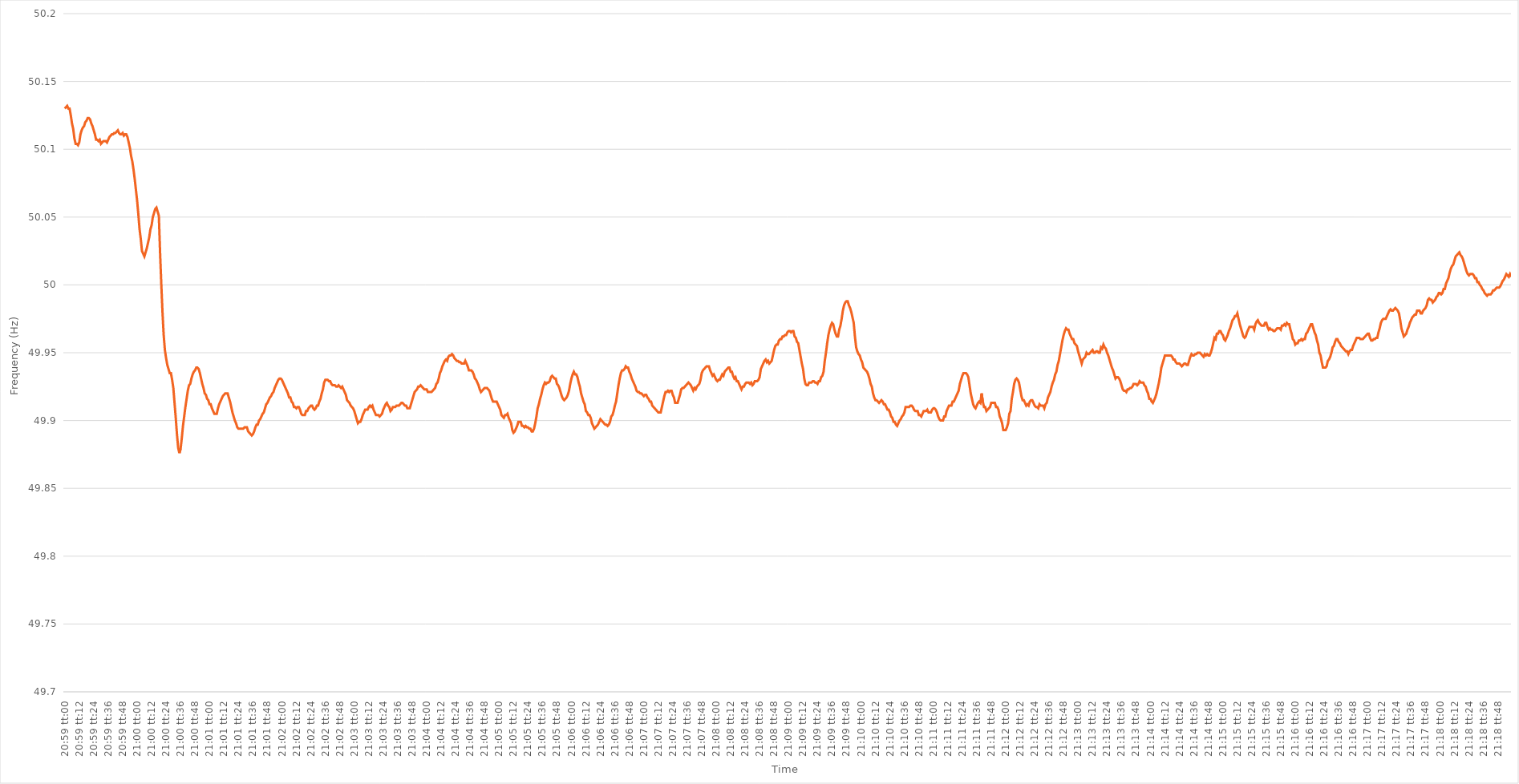
| Category | Series 0 |
|---|---|
| 0.8743055555555556 | 50.13 |
| 0.8743171296296296 | 50.131 |
| 0.8743287037037036 | 50.132 |
| 0.8743402777777778 | 50.13 |
| 0.8743518518518519 | 50.13 |
| 0.8743634259259259 | 50.125 |
| 0.874375 | 50.119 |
| 0.874386574074074 | 50.115 |
| 0.8743981481481482 | 50.108 |
| 0.8744097222222221 | 50.104 |
| 0.8744212962962963 | 50.104 |
| 0.8744328703703704 | 50.103 |
| 0.8744444444444445 | 50.105 |
| 0.8744560185185185 | 50.111 |
| 0.8744675925925925 | 50.114 |
| 0.8744791666666667 | 50.116 |
| 0.8744907407407408 | 50.117 |
| 0.8745023148148148 | 50.12 |
| 0.8745138888888889 | 50.121 |
| 0.874525462962963 | 50.123 |
| 0.874537037037037 | 50.123 |
| 0.874548611111111 | 50.122 |
| 0.8745601851851852 | 50.119 |
| 0.8745717592592593 | 50.117 |
| 0.8745833333333333 | 50.114 |
| 0.8745949074074074 | 50.111 |
| 0.8746064814814815 | 50.107 |
| 0.8746180555555556 | 50.107 |
| 0.8746296296296295 | 50.106 |
| 0.8746412037037037 | 50.107 |
| 0.8746527777777778 | 50.104 |
| 0.8746643518518519 | 50.105 |
| 0.8746759259259259 | 50.106 |
| 0.8746875 | 50.106 |
| 0.8746990740740741 | 50.106 |
| 0.8747106481481483 | 50.105 |
| 0.8747222222222222 | 50.107 |
| 0.8747337962962963 | 50.109 |
| 0.8747453703703704 | 50.11 |
| 0.8747569444444444 | 50.111 |
| 0.8747685185185184 | 50.111 |
| 0.8747800925925926 | 50.112 |
| 0.8747916666666667 | 50.112 |
| 0.8748032407407407 | 50.113 |
| 0.8748148148148148 | 50.114 |
| 0.8748263888888889 | 50.112 |
| 0.874837962962963 | 50.111 |
| 0.8748495370370369 | 50.111 |
| 0.8748611111111111 | 50.112 |
| 0.8748726851851852 | 50.11 |
| 0.8748842592592593 | 50.111 |
| 0.8748958333333333 | 50.111 |
| 0.8749074074074074 | 50.109 |
| 0.8749189814814815 | 50.105 |
| 0.8749305555555557 | 50.101 |
| 0.8749421296296296 | 50.095 |
| 0.8749537037037037 | 50.091 |
| 0.8749652777777778 | 50.085 |
| 0.8749768518518519 | 50.078 |
| 0.8749884259259259 | 50.07 |
| 0.875 | 50.062 |
| 0.8750115740740741 | 50.052 |
| 0.8750231481481481 | 50.041 |
| 0.8750347222222222 | 50.034 |
| 0.8750462962962963 | 50.025 |
| 0.8750578703703704 | 50.023 |
| 0.8750694444444443 | 50.021 |
| 0.8750810185185185 | 50.024 |
| 0.8750925925925926 | 50.027 |
| 0.8751041666666667 | 50.031 |
| 0.8751157407407407 | 50.035 |
| 0.8751273148148148 | 50.041 |
| 0.8751388888888889 | 50.044 |
| 0.8751504629629631 | 50.05 |
| 0.875162037037037 | 50.053 |
| 0.8751736111111111 | 50.056 |
| 0.8751851851851852 | 50.057 |
| 0.8751967592592593 | 50.054 |
| 0.8752083333333333 | 50.051 |
| 0.8752199074074074 | 50.024 |
| 0.8752314814814816 | 50.001 |
| 0.8752430555555555 | 49.98 |
| 0.8752546296296296 | 49.963 |
| 0.8752662037037037 | 49.952 |
| 0.8752777777777778 | 49.946 |
| 0.8752893518518517 | 49.941 |
| 0.8753009259259259 | 49.938 |
| 0.8753125 | 49.935 |
| 0.8753240740740741 | 49.935 |
| 0.8753356481481481 | 49.93 |
| 0.8753472222222222 | 49.924 |
| 0.8753587962962963 | 49.913 |
| 0.8753703703703705 | 49.902 |
| 0.8753819444444444 | 49.89 |
| 0.8753935185185185 | 49.88 |
| 0.8754050925925926 | 49.876 |
| 0.8754166666666667 | 49.879 |
| 0.8754282407407407 | 49.887 |
| 0.8754398148148148 | 49.896 |
| 0.875451388888889 | 49.903 |
| 0.875462962962963 | 49.91 |
| 0.875474537037037 | 49.916 |
| 0.8754861111111111 | 49.922 |
| 0.8754976851851852 | 49.926 |
| 0.8755092592592592 | 49.927 |
| 0.8755208333333333 | 49.931 |
| 0.8755324074074075 | 49.934 |
| 0.8755439814814815 | 49.936 |
| 0.8755555555555555 | 49.937 |
| 0.8755671296296296 | 49.939 |
| 0.8755787037037037 | 49.939 |
| 0.8755902777777779 | 49.938 |
| 0.8756018518518518 | 49.935 |
| 0.875613425925926 | 49.931 |
| 0.875625 | 49.927 |
| 0.8756365740740741 | 49.924 |
| 0.8756481481481481 | 49.92 |
| 0.8756597222222222 | 49.919 |
| 0.8756712962962964 | 49.916 |
| 0.8756828703703704 | 49.915 |
| 0.8756944444444444 | 49.912 |
| 0.8757060185185185 | 49.912 |
| 0.8757175925925926 | 49.909 |
| 0.8757291666666666 | 49.907 |
| 0.8757407407407407 | 49.905 |
| 0.8757523148148149 | 49.905 |
| 0.8757638888888889 | 49.905 |
| 0.8757754629629629 | 49.909 |
| 0.875787037037037 | 49.912 |
| 0.8757986111111111 | 49.914 |
| 0.8758101851851853 | 49.916 |
| 0.8758217592592592 | 49.918 |
| 0.8758333333333334 | 49.919 |
| 0.8758449074074074 | 49.92 |
| 0.8758564814814815 | 49.92 |
| 0.8758680555555555 | 49.92 |
| 0.8758796296296296 | 49.917 |
| 0.8758912037037038 | 49.914 |
| 0.8759027777777778 | 49.91 |
| 0.8759143518518518 | 49.906 |
| 0.8759259259259259 | 49.903 |
| 0.8759375 | 49.9 |
| 0.875949074074074 | 49.898 |
| 0.8759606481481481 | 49.895 |
| 0.8759722222222223 | 49.894 |
| 0.8759837962962963 | 49.894 |
| 0.8759953703703703 | 49.894 |
| 0.8760069444444444 | 49.894 |
| 0.8760185185185185 | 49.894 |
| 0.8760300925925927 | 49.895 |
| 0.8760416666666666 | 49.895 |
| 0.8760532407407408 | 49.895 |
| 0.8760648148148148 | 49.892 |
| 0.876076388888889 | 49.891 |
| 0.8760879629629629 | 49.89 |
| 0.876099537037037 | 49.889 |
| 0.8761111111111112 | 49.89 |
| 0.8761226851851852 | 49.892 |
| 0.8761342592592593 | 49.895 |
| 0.8761458333333333 | 49.897 |
| 0.8761574074074074 | 49.897 |
| 0.8761689814814816 | 49.9 |
| 0.8761805555555555 | 49.901 |
| 0.8761921296296297 | 49.903 |
| 0.8762037037037037 | 49.905 |
| 0.8762152777777777 | 49.906 |
| 0.8762268518518518 | 49.909 |
| 0.8762384259259259 | 49.912 |
| 0.8762500000000001 | 49.913 |
| 0.876261574074074 | 49.915 |
| 0.8762731481481482 | 49.917 |
| 0.8762847222222222 | 49.918 |
| 0.8762962962962964 | 49.92 |
| 0.8763078703703703 | 49.921 |
| 0.8763194444444444 | 49.924 |
| 0.8763310185185186 | 49.926 |
| 0.8763425925925926 | 49.928 |
| 0.8763541666666667 | 49.93 |
| 0.8763657407407407 | 49.931 |
| 0.8763773148148148 | 49.931 |
| 0.876388888888889 | 49.93 |
| 0.8764004629629629 | 49.928 |
| 0.8764120370370371 | 49.926 |
| 0.8764236111111111 | 49.924 |
| 0.8764351851851852 | 49.922 |
| 0.8764467592592592 | 49.92 |
| 0.8764583333333333 | 49.917 |
| 0.8764699074074075 | 49.917 |
| 0.8764814814814814 | 49.914 |
| 0.8764930555555556 | 49.913 |
| 0.8765046296296296 | 49.91 |
| 0.8765162037037038 | 49.91 |
| 0.8765277777777777 | 49.909 |
| 0.8765393518518518 | 49.91 |
| 0.876550925925926 | 49.91 |
| 0.8765625 | 49.908 |
| 0.8765740740740741 | 49.905 |
| 0.8765856481481481 | 49.904 |
| 0.8765972222222222 | 49.904 |
| 0.8766087962962964 | 49.904 |
| 0.8766203703703703 | 49.907 |
| 0.8766319444444445 | 49.907 |
| 0.8766435185185185 | 49.909 |
| 0.8766550925925927 | 49.91 |
| 0.8766666666666666 | 49.911 |
| 0.8766782407407407 | 49.911 |
| 0.8766898148148149 | 49.909 |
| 0.8767013888888888 | 49.908 |
| 0.876712962962963 | 49.909 |
| 0.876724537037037 | 49.911 |
| 0.8767361111111112 | 49.911 |
| 0.8767476851851851 | 49.914 |
| 0.8767592592592592 | 49.916 |
| 0.8767708333333334 | 49.92 |
| 0.8767824074074074 | 49.923 |
| 0.8767939814814815 | 49.928 |
| 0.8768055555555555 | 49.93 |
| 0.8768171296296297 | 49.93 |
| 0.8768287037037038 | 49.93 |
| 0.8768402777777777 | 49.929 |
| 0.8768518518518519 | 49.929 |
| 0.8768634259259259 | 49.927 |
| 0.8768750000000001 | 49.926 |
| 0.876886574074074 | 49.926 |
| 0.8768981481481481 | 49.926 |
| 0.8769097222222223 | 49.925 |
| 0.8769212962962962 | 49.925 |
| 0.8769328703703704 | 49.926 |
| 0.8769444444444444 | 49.925 |
| 0.8769560185185186 | 49.924 |
| 0.8769675925925925 | 49.925 |
| 0.8769791666666666 | 49.923 |
| 0.8769907407407408 | 49.921 |
| 0.8770023148148148 | 49.919 |
| 0.8770138888888889 | 49.915 |
| 0.8770254629629629 | 49.914 |
| 0.8770370370370371 | 49.913 |
| 0.8770486111111112 | 49.911 |
| 0.8770601851851851 | 49.91 |
| 0.8770717592592593 | 49.909 |
| 0.8770833333333333 | 49.907 |
| 0.8770949074074075 | 49.904 |
| 0.8771064814814814 | 49.901 |
| 0.8771180555555556 | 49.898 |
| 0.8771296296296297 | 49.899 |
| 0.8771412037037036 | 49.899 |
| 0.8771527777777778 | 49.901 |
| 0.8771643518518518 | 49.904 |
| 0.877175925925926 | 49.906 |
| 0.8771874999999999 | 49.908 |
| 0.877199074074074 | 49.908 |
| 0.8772106481481482 | 49.908 |
| 0.8772222222222222 | 49.91 |
| 0.8772337962962963 | 49.911 |
| 0.8772453703703703 | 49.91 |
| 0.8772569444444445 | 49.911 |
| 0.8772685185185186 | 49.908 |
| 0.8772800925925925 | 49.906 |
| 0.8772916666666667 | 49.904 |
| 0.8773032407407407 | 49.904 |
| 0.8773148148148149 | 49.904 |
| 0.8773263888888888 | 49.903 |
| 0.877337962962963 | 49.904 |
| 0.8773495370370371 | 49.905 |
| 0.8773611111111111 | 49.908 |
| 0.8773726851851852 | 49.91 |
| 0.8773842592592592 | 49.912 |
| 0.8773958333333334 | 49.913 |
| 0.8774074074074073 | 49.911 |
| 0.8774189814814815 | 49.91 |
| 0.8774305555555556 | 49.907 |
| 0.8774421296296296 | 49.908 |
| 0.8774537037037037 | 49.91 |
| 0.8774652777777777 | 49.91 |
| 0.8774768518518519 | 49.91 |
| 0.877488425925926 | 49.911 |
| 0.8775 | 49.911 |
| 0.8775115740740741 | 49.911 |
| 0.8775231481481481 | 49.912 |
| 0.8775347222222223 | 49.913 |
| 0.8775462962962962 | 49.913 |
| 0.8775578703703704 | 49.912 |
| 0.8775694444444445 | 49.911 |
| 0.8775810185185186 | 49.911 |
| 0.8775925925925926 | 49.909 |
| 0.8776041666666666 | 49.909 |
| 0.8776157407407408 | 49.909 |
| 0.8776273148148147 | 49.912 |
| 0.8776388888888889 | 49.915 |
| 0.877650462962963 | 49.918 |
| 0.877662037037037 | 49.921 |
| 0.8776736111111111 | 49.922 |
| 0.8776851851851851 | 49.923 |
| 0.8776967592592593 | 49.925 |
| 0.8777083333333334 | 49.925 |
| 0.8777199074074074 | 49.926 |
| 0.8777314814814815 | 49.925 |
| 0.8777430555555555 | 49.924 |
| 0.8777546296296297 | 49.923 |
| 0.8777662037037036 | 49.923 |
| 0.8777777777777778 | 49.923 |
| 0.8777893518518519 | 49.921 |
| 0.877800925925926 | 49.921 |
| 0.8778125 | 49.921 |
| 0.877824074074074 | 49.921 |
| 0.8778356481481482 | 49.922 |
| 0.8778472222222221 | 49.923 |
| 0.8778587962962963 | 49.924 |
| 0.8778703703703704 | 49.927 |
| 0.8778819444444445 | 49.928 |
| 0.8778935185185185 | 49.931 |
| 0.8779050925925925 | 49.935 |
| 0.8779166666666667 | 49.937 |
| 0.8779282407407408 | 49.94 |
| 0.8779398148148148 | 49.942 |
| 0.8779513888888889 | 49.944 |
| 0.877962962962963 | 49.945 |
| 0.8779745370370371 | 49.944 |
| 0.877986111111111 | 49.947 |
| 0.8779976851851852 | 49.948 |
| 0.8780092592592593 | 49.948 |
| 0.8780208333333334 | 49.949 |
| 0.8780324074074074 | 49.948 |
| 0.8780439814814814 | 49.946 |
| 0.8780555555555556 | 49.945 |
| 0.8780671296296297 | 49.944 |
| 0.8780787037037037 | 49.944 |
| 0.8780902777777778 | 49.943 |
| 0.8781018518518519 | 49.943 |
| 0.8781134259259259 | 49.942 |
| 0.8781249999999999 | 49.942 |
| 0.8781365740740741 | 49.942 |
| 0.8781481481481482 | 49.944 |
| 0.8781597222222222 | 49.942 |
| 0.8781712962962963 | 49.94 |
| 0.8781828703703703 | 49.937 |
| 0.8781944444444445 | 49.937 |
| 0.8782060185185184 | 49.937 |
| 0.8782175925925926 | 49.936 |
| 0.8782291666666667 | 49.934 |
| 0.8782407407407408 | 49.931 |
| 0.8782523148148148 | 49.93 |
| 0.8782638888888888 | 49.928 |
| 0.878275462962963 | 49.926 |
| 0.8782870370370371 | 49.923 |
| 0.8782986111111111 | 49.921 |
| 0.8783101851851852 | 49.922 |
| 0.8783217592592593 | 49.923 |
| 0.8783333333333333 | 49.924 |
| 0.8783449074074073 | 49.924 |
| 0.8783564814814815 | 49.924 |
| 0.8783680555555556 | 49.923 |
| 0.8783796296296296 | 49.922 |
| 0.8783912037037037 | 49.919 |
| 0.8784027777777778 | 49.916 |
| 0.8784143518518519 | 49.914 |
| 0.8784259259259258 | 49.914 |
| 0.8784375 | 49.914 |
| 0.8784490740740741 | 49.914 |
| 0.8784606481481482 | 49.912 |
| 0.8784722222222222 | 49.91 |
| 0.8784837962962962 | 49.908 |
| 0.8784953703703704 | 49.904 |
| 0.8785069444444445 | 49.903 |
| 0.8785185185185185 | 49.902 |
| 0.8785300925925926 | 49.904 |
| 0.8785416666666667 | 49.904 |
| 0.8785532407407407 | 49.905 |
| 0.8785648148148147 | 49.902 |
| 0.8785763888888889 | 49.9 |
| 0.878587962962963 | 49.898 |
| 0.878599537037037 | 49.893 |
| 0.8786111111111111 | 49.891 |
| 0.8786226851851852 | 49.892 |
| 0.8786342592592593 | 49.894 |
| 0.8786458333333332 | 49.896 |
| 0.8786574074074074 | 49.899 |
| 0.8786689814814815 | 49.899 |
| 0.8786805555555556 | 49.899 |
| 0.8786921296296296 | 49.896 |
| 0.8787037037037037 | 49.896 |
| 0.8787152777777778 | 49.895 |
| 0.878726851851852 | 49.896 |
| 0.8787384259259259 | 49.895 |
| 0.87875 | 49.895 |
| 0.8787615740740741 | 49.894 |
| 0.8787731481481482 | 49.894 |
| 0.8787847222222221 | 49.892 |
| 0.8787962962962963 | 49.892 |
| 0.8788078703703704 | 49.894 |
| 0.8788194444444444 | 49.898 |
| 0.8788310185185185 | 49.903 |
| 0.8788425925925926 | 49.909 |
| 0.8788541666666667 | 49.912 |
| 0.8788657407407406 | 49.916 |
| 0.8788773148148148 | 49.919 |
| 0.8788888888888889 | 49.923 |
| 0.878900462962963 | 49.926 |
| 0.878912037037037 | 49.928 |
| 0.8789236111111111 | 49.927 |
| 0.8789351851851852 | 49.928 |
| 0.8789467592592594 | 49.928 |
| 0.8789583333333333 | 49.929 |
| 0.8789699074074074 | 49.932 |
| 0.8789814814814815 | 49.933 |
| 0.8789930555555556 | 49.932 |
| 0.8790046296296296 | 49.931 |
| 0.8790162037037037 | 49.931 |
| 0.8790277777777779 | 49.927 |
| 0.8790393518518518 | 49.926 |
| 0.8790509259259259 | 49.924 |
| 0.8790625 | 49.921 |
| 0.8790740740740741 | 49.918 |
| 0.879085648148148 | 49.916 |
| 0.8790972222222222 | 49.915 |
| 0.8791087962962963 | 49.916 |
| 0.8791203703703704 | 49.917 |
| 0.8791319444444444 | 49.919 |
| 0.8791435185185185 | 49.922 |
| 0.8791550925925926 | 49.927 |
| 0.8791666666666668 | 49.931 |
| 0.8791782407407407 | 49.934 |
| 0.8791898148148148 | 49.936 |
| 0.8792013888888889 | 49.934 |
| 0.879212962962963 | 49.934 |
| 0.879224537037037 | 49.932 |
| 0.8792361111111111 | 49.928 |
| 0.8792476851851853 | 49.925 |
| 0.8792592592592593 | 49.92 |
| 0.8792708333333333 | 49.917 |
| 0.8792824074074074 | 49.914 |
| 0.8792939814814815 | 49.912 |
| 0.8793055555555555 | 49.907 |
| 0.8793171296296296 | 49.906 |
| 0.8793287037037038 | 49.904 |
| 0.8793402777777778 | 49.904 |
| 0.8793518518518518 | 49.902 |
| 0.8793634259259259 | 49.898 |
| 0.879375 | 49.896 |
| 0.8793865740740742 | 49.894 |
| 0.8793981481481481 | 49.895 |
| 0.8794097222222222 | 49.896 |
| 0.8794212962962963 | 49.897 |
| 0.8794328703703704 | 49.899 |
| 0.8794444444444444 | 49.901 |
| 0.8794560185185185 | 49.9 |
| 0.8794675925925927 | 49.899 |
| 0.8794791666666667 | 49.898 |
| 0.8794907407407407 | 49.897 |
| 0.8795023148148148 | 49.897 |
| 0.8795138888888889 | 49.896 |
| 0.8795254629629629 | 49.897 |
| 0.879537037037037 | 49.899 |
| 0.8795486111111112 | 49.903 |
| 0.8795601851851852 | 49.904 |
| 0.8795717592592592 | 49.907 |
| 0.8795833333333333 | 49.911 |
| 0.8795949074074074 | 49.914 |
| 0.8796064814814816 | 49.92 |
| 0.8796180555555555 | 49.926 |
| 0.8796296296296297 | 49.931 |
| 0.8796412037037037 | 49.935 |
| 0.8796527777777778 | 49.937 |
| 0.8796643518518518 | 49.937 |
| 0.8796759259259259 | 49.938 |
| 0.8796875000000001 | 49.94 |
| 0.8796990740740741 | 49.939 |
| 0.8797106481481481 | 49.939 |
| 0.8797222222222222 | 49.936 |
| 0.8797337962962963 | 49.934 |
| 0.8797453703703703 | 49.931 |
| 0.8797569444444444 | 49.929 |
| 0.8797685185185186 | 49.927 |
| 0.8797800925925926 | 49.925 |
| 0.8797916666666666 | 49.922 |
| 0.8798032407407407 | 49.921 |
| 0.8798148148148148 | 49.921 |
| 0.879826388888889 | 49.92 |
| 0.8798379629629629 | 49.92 |
| 0.879849537037037 | 49.919 |
| 0.8798611111111111 | 49.918 |
| 0.8798726851851852 | 49.919 |
| 0.8798842592592592 | 49.919 |
| 0.8798958333333333 | 49.917 |
| 0.8799074074074075 | 49.916 |
| 0.8799189814814815 | 49.914 |
| 0.8799305555555555 | 49.914 |
| 0.8799421296296296 | 49.911 |
| 0.8799537037037037 | 49.91 |
| 0.8799652777777779 | 49.909 |
| 0.8799768518518518 | 49.908 |
| 0.879988425925926 | 49.907 |
| 0.88 | 49.906 |
| 0.880011574074074 | 49.906 |
| 0.8800231481481481 | 49.906 |
| 0.8800347222222222 | 49.91 |
| 0.8800462962962964 | 49.914 |
| 0.8800578703703703 | 49.918 |
| 0.8800694444444445 | 49.921 |
| 0.8800810185185185 | 49.921 |
| 0.8800925925925926 | 49.922 |
| 0.8801041666666666 | 49.921 |
| 0.8801157407407407 | 49.922 |
| 0.8801273148148149 | 49.922 |
| 0.8801388888888889 | 49.919 |
| 0.880150462962963 | 49.917 |
| 0.880162037037037 | 49.913 |
| 0.8801736111111111 | 49.913 |
| 0.8801851851851853 | 49.913 |
| 0.8801967592592592 | 49.916 |
| 0.8802083333333334 | 49.919 |
| 0.8802199074074074 | 49.923 |
| 0.8802314814814814 | 49.924 |
| 0.8802430555555555 | 49.924 |
| 0.8802546296296296 | 49.925 |
| 0.8802662037037038 | 49.926 |
| 0.8802777777777777 | 49.927 |
| 0.8802893518518519 | 49.928 |
| 0.8803009259259259 | 49.927 |
| 0.8803125 | 49.926 |
| 0.880324074074074 | 49.924 |
| 0.8803356481481481 | 49.922 |
| 0.8803472222222223 | 49.924 |
| 0.8803587962962963 | 49.923 |
| 0.8803703703703704 | 49.925 |
| 0.8803819444444444 | 49.926 |
| 0.8803935185185185 | 49.927 |
| 0.8804050925925927 | 49.93 |
| 0.8804166666666666 | 49.935 |
| 0.8804282407407408 | 49.937 |
| 0.8804398148148148 | 49.938 |
| 0.8804513888888889 | 49.939 |
| 0.8804629629629629 | 49.94 |
| 0.880474537037037 | 49.94 |
| 0.8804861111111112 | 49.94 |
| 0.8804976851851851 | 49.937 |
| 0.8805092592592593 | 49.935 |
| 0.8805208333333333 | 49.933 |
| 0.8805324074074075 | 49.934 |
| 0.8805439814814814 | 49.932 |
| 0.8805555555555555 | 49.93 |
| 0.8805671296296297 | 49.929 |
| 0.8805787037037037 | 49.93 |
| 0.8805902777777778 | 49.93 |
| 0.8806018518518518 | 49.932 |
| 0.880613425925926 | 49.934 |
| 0.8806250000000001 | 49.933 |
| 0.880636574074074 | 49.936 |
| 0.8806481481481482 | 49.937 |
| 0.8806597222222222 | 49.938 |
| 0.8806712962962964 | 49.939 |
| 0.8806828703703703 | 49.939 |
| 0.8806944444444444 | 49.936 |
| 0.8807060185185186 | 49.936 |
| 0.8807175925925925 | 49.933 |
| 0.8807291666666667 | 49.931 |
| 0.8807407407407407 | 49.932 |
| 0.8807523148148149 | 49.929 |
| 0.8807638888888888 | 49.929 |
| 0.8807754629629629 | 49.927 |
| 0.8807870370370371 | 49.925 |
| 0.8807986111111111 | 49.923 |
| 0.8808101851851852 | 49.925 |
| 0.8808217592592592 | 49.925 |
| 0.8808333333333334 | 49.927 |
| 0.8808449074074075 | 49.928 |
| 0.8808564814814814 | 49.928 |
| 0.8808680555555556 | 49.928 |
| 0.8808796296296296 | 49.927 |
| 0.8808912037037038 | 49.928 |
| 0.8809027777777777 | 49.926 |
| 0.8809143518518519 | 49.927 |
| 0.880925925925926 | 49.929 |
| 0.8809374999999999 | 49.929 |
| 0.8809490740740741 | 49.929 |
| 0.8809606481481481 | 49.93 |
| 0.8809722222222223 | 49.932 |
| 0.8809837962962962 | 49.938 |
| 0.8809953703703703 | 49.94 |
| 0.8810069444444445 | 49.942 |
| 0.8810185185185185 | 49.944 |
| 0.8810300925925926 | 49.945 |
| 0.8810416666666666 | 49.943 |
| 0.8810532407407408 | 49.944 |
| 0.8810648148148149 | 49.942 |
| 0.8810763888888888 | 49.943 |
| 0.881087962962963 | 49.944 |
| 0.881099537037037 | 49.948 |
| 0.8811111111111112 | 49.952 |
| 0.8811226851851851 | 49.955 |
| 0.8811342592592593 | 49.956 |
| 0.8811458333333334 | 49.956 |
| 0.8811574074074073 | 49.959 |
| 0.8811689814814815 | 49.96 |
| 0.8811805555555555 | 49.96 |
| 0.8811921296296297 | 49.962 |
| 0.8812037037037036 | 49.962 |
| 0.8812152777777778 | 49.963 |
| 0.8812268518518519 | 49.963 |
| 0.8812384259259259 | 49.965 |
| 0.88125 | 49.966 |
| 0.881261574074074 | 49.966 |
| 0.8812731481481482 | 49.965 |
| 0.8812847222222223 | 49.966 |
| 0.8812962962962962 | 49.966 |
| 0.8813078703703704 | 49.962 |
| 0.8813194444444444 | 49.961 |
| 0.8813310185185186 | 49.958 |
| 0.8813425925925925 | 49.957 |
| 0.8813541666666667 | 49.952 |
| 0.8813657407407408 | 49.947 |
| 0.8813773148148148 | 49.942 |
| 0.8813888888888889 | 49.938 |
| 0.8814004629629629 | 49.931 |
| 0.8814120370370371 | 49.927 |
| 0.881423611111111 | 49.926 |
| 0.8814351851851852 | 49.926 |
| 0.8814467592592593 | 49.928 |
| 0.8814583333333333 | 49.928 |
| 0.8814699074074074 | 49.928 |
| 0.8814814814814814 | 49.929 |
| 0.8814930555555556 | 49.929 |
| 0.8815046296296297 | 49.928 |
| 0.8815162037037036 | 49.928 |
| 0.8815277777777778 | 49.927 |
| 0.8815393518518518 | 49.929 |
| 0.881550925925926 | 49.929 |
| 0.8815624999999999 | 49.932 |
| 0.8815740740740741 | 49.933 |
| 0.8815856481481482 | 49.936 |
| 0.8815972222222223 | 49.944 |
| 0.8816087962962963 | 49.95 |
| 0.8816203703703703 | 49.957 |
| 0.8816319444444445 | 49.963 |
| 0.8816435185185184 | 49.967 |
| 0.8816550925925926 | 49.97 |
| 0.8816666666666667 | 49.972 |
| 0.8816782407407407 | 49.971 |
| 0.8816898148148148 | 49.967 |
| 0.8817013888888888 | 49.964 |
| 0.881712962962963 | 49.962 |
| 0.8817245370370371 | 49.962 |
| 0.881736111111111 | 49.967 |
| 0.8817476851851852 | 49.97 |
| 0.8817592592592592 | 49.975 |
| 0.8817708333333334 | 49.981 |
| 0.8817824074074073 | 49.985 |
| 0.8817939814814815 | 49.987 |
| 0.8818055555555556 | 49.988 |
| 0.8818171296296297 | 49.988 |
| 0.8818287037037037 | 49.985 |
| 0.8818402777777777 | 49.983 |
| 0.8818518518518519 | 49.98 |
| 0.881863425925926 | 49.976 |
| 0.881875 | 49.972 |
| 0.8818865740740741 | 49.962 |
| 0.8818981481481482 | 49.954 |
| 0.8819097222222222 | 49.951 |
| 0.8819212962962962 | 49.949 |
| 0.8819328703703704 | 49.948 |
| 0.8819444444444445 | 49.945 |
| 0.8819560185185185 | 49.943 |
| 0.8819675925925926 | 49.939 |
| 0.8819791666666666 | 49.938 |
| 0.8819907407407408 | 49.937 |
| 0.8820023148148147 | 49.936 |
| 0.8820138888888889 | 49.934 |
| 0.882025462962963 | 49.931 |
| 0.8820370370370371 | 49.927 |
| 0.8820486111111111 | 49.925 |
| 0.8820601851851851 | 49.92 |
| 0.8820717592592593 | 49.917 |
| 0.8820833333333334 | 49.915 |
| 0.8820949074074074 | 49.915 |
| 0.8821064814814815 | 49.914 |
| 0.8821180555555556 | 49.913 |
| 0.8821296296296296 | 49.914 |
| 0.8821412037037036 | 49.915 |
| 0.8821527777777778 | 49.914 |
| 0.8821643518518519 | 49.912 |
| 0.8821759259259259 | 49.912 |
| 0.8821875 | 49.91 |
| 0.882199074074074 | 49.908 |
| 0.8822106481481482 | 49.908 |
| 0.8822222222222221 | 49.906 |
| 0.8822337962962963 | 49.903 |
| 0.8822453703703704 | 49.902 |
| 0.8822569444444445 | 49.899 |
| 0.8822685185185185 | 49.899 |
| 0.8822800925925925 | 49.897 |
| 0.8822916666666667 | 49.896 |
| 0.8823032407407408 | 49.898 |
| 0.8823148148148148 | 49.9 |
| 0.8823263888888889 | 49.901 |
| 0.882337962962963 | 49.903 |
| 0.882349537037037 | 49.904 |
| 0.882361111111111 | 49.906 |
| 0.8823726851851852 | 49.91 |
| 0.8823842592592593 | 49.91 |
| 0.8823958333333333 | 49.91 |
| 0.8824074074074074 | 49.91 |
| 0.8824189814814815 | 49.911 |
| 0.8824305555555556 | 49.911 |
| 0.8824421296296295 | 49.91 |
| 0.8824537037037037 | 49.908 |
| 0.8824652777777778 | 49.907 |
| 0.8824768518518519 | 49.907 |
| 0.8824884259259259 | 49.907 |
| 0.8825 | 49.904 |
| 0.8825115740740741 | 49.904 |
| 0.8825231481481483 | 49.903 |
| 0.8825347222222222 | 49.905 |
| 0.8825462962962963 | 49.907 |
| 0.8825578703703704 | 49.907 |
| 0.8825694444444445 | 49.907 |
| 0.8825810185185184 | 49.908 |
| 0.8825925925925926 | 49.906 |
| 0.8826041666666667 | 49.906 |
| 0.8826157407407407 | 49.906 |
| 0.8826273148148148 | 49.908 |
| 0.8826388888888889 | 49.909 |
| 0.882650462962963 | 49.909 |
| 0.8826620370370369 | 49.908 |
| 0.8826736111111111 | 49.906 |
| 0.8826851851851852 | 49.903 |
| 0.8826967592592593 | 49.901 |
| 0.8827083333333333 | 49.9 |
| 0.8827199074074074 | 49.9 |
| 0.8827314814814815 | 49.9 |
| 0.8827430555555557 | 49.903 |
| 0.8827546296296296 | 49.903 |
| 0.8827662037037037 | 49.907 |
| 0.8827777777777778 | 49.909 |
| 0.8827893518518519 | 49.911 |
| 0.8828009259259259 | 49.911 |
| 0.8828125 | 49.911 |
| 0.8828240740740741 | 49.914 |
| 0.8828356481481481 | 49.914 |
| 0.8828472222222222 | 49.916 |
| 0.8828587962962963 | 49.918 |
| 0.8828703703703704 | 49.92 |
| 0.8828819444444443 | 49.922 |
| 0.8828935185185185 | 49.927 |
| 0.8829050925925926 | 49.93 |
| 0.8829166666666667 | 49.933 |
| 0.8829282407407407 | 49.935 |
| 0.8829398148148148 | 49.935 |
| 0.8829513888888889 | 49.935 |
| 0.8829629629629631 | 49.934 |
| 0.882974537037037 | 49.932 |
| 0.8829861111111111 | 49.926 |
| 0.8829976851851852 | 49.92 |
| 0.8830092592592593 | 49.916 |
| 0.8830208333333333 | 49.912 |
| 0.8830324074074074 | 49.91 |
| 0.8830439814814816 | 49.909 |
| 0.8830555555555555 | 49.911 |
| 0.8830671296296296 | 49.913 |
| 0.8830787037037037 | 49.914 |
| 0.8830902777777778 | 49.913 |
| 0.8831018518518517 | 49.92 |
| 0.8831134259259259 | 49.914 |
| 0.883125 | 49.91 |
| 0.8831365740740741 | 49.91 |
| 0.8831481481481481 | 49.907 |
| 0.8831597222222222 | 49.908 |
| 0.8831712962962963 | 49.909 |
| 0.8831828703703705 | 49.91 |
| 0.8831944444444444 | 49.913 |
| 0.8832060185185185 | 49.913 |
| 0.8832175925925926 | 49.913 |
| 0.8832291666666667 | 49.913 |
| 0.8832407407407407 | 49.91 |
| 0.8832523148148148 | 49.91 |
| 0.883263888888889 | 49.908 |
| 0.883275462962963 | 49.903 |
| 0.883287037037037 | 49.901 |
| 0.8832986111111111 | 49.898 |
| 0.8833101851851852 | 49.893 |
| 0.8833217592592592 | 49.893 |
| 0.8833333333333333 | 49.893 |
| 0.8833449074074075 | 49.895 |
| 0.8833564814814815 | 49.898 |
| 0.8833680555555555 | 49.905 |
| 0.8833796296296296 | 49.907 |
| 0.8833912037037037 | 49.916 |
| 0.8834027777777779 | 49.921 |
| 0.8834143518518518 | 49.927 |
| 0.883425925925926 | 49.93 |
| 0.8834375 | 49.931 |
| 0.8834490740740741 | 49.93 |
| 0.8834606481481481 | 49.928 |
| 0.8834722222222222 | 49.923 |
| 0.8834837962962964 | 49.918 |
| 0.8834953703703704 | 49.915 |
| 0.8835069444444444 | 49.915 |
| 0.8835185185185185 | 49.913 |
| 0.8835300925925926 | 49.911 |
| 0.8835416666666666 | 49.912 |
| 0.8835532407407407 | 49.911 |
| 0.8835648148148149 | 49.914 |
| 0.8835763888888889 | 49.915 |
| 0.8835879629629629 | 49.915 |
| 0.883599537037037 | 49.913 |
| 0.8836111111111111 | 49.911 |
| 0.8836226851851853 | 49.91 |
| 0.8836342592592592 | 49.91 |
| 0.8836458333333334 | 49.909 |
| 0.8836574074074074 | 49.912 |
| 0.8836689814814815 | 49.911 |
| 0.8836805555555555 | 49.911 |
| 0.8836921296296296 | 49.911 |
| 0.8837037037037038 | 49.909 |
| 0.8837152777777778 | 49.912 |
| 0.8837268518518518 | 49.913 |
| 0.8837384259259259 | 49.917 |
| 0.88375 | 49.919 |
| 0.883761574074074 | 49.921 |
| 0.8837731481481481 | 49.925 |
| 0.8837847222222223 | 49.928 |
| 0.8837962962962963 | 49.93 |
| 0.8838078703703703 | 49.934 |
| 0.8838194444444444 | 49.936 |
| 0.8838310185185185 | 49.941 |
| 0.8838425925925927 | 49.944 |
| 0.8838541666666666 | 49.949 |
| 0.8838657407407408 | 49.954 |
| 0.8838773148148148 | 49.959 |
| 0.883888888888889 | 49.963 |
| 0.8839004629629629 | 49.966 |
| 0.883912037037037 | 49.968 |
| 0.8839236111111112 | 49.967 |
| 0.8839351851851852 | 49.967 |
| 0.8839467592592593 | 49.964 |
| 0.8839583333333333 | 49.962 |
| 0.8839699074074074 | 49.96 |
| 0.8839814814814816 | 49.96 |
| 0.8839930555555555 | 49.957 |
| 0.8840046296296297 | 49.956 |
| 0.8840162037037037 | 49.955 |
| 0.8840277777777777 | 49.951 |
| 0.8840393518518518 | 49.948 |
| 0.8840509259259259 | 49.945 |
| 0.8840625000000001 | 49.942 |
| 0.884074074074074 | 49.945 |
| 0.8840856481481482 | 49.946 |
| 0.8840972222222222 | 49.947 |
| 0.8841087962962964 | 49.95 |
| 0.8841203703703703 | 49.949 |
| 0.8841319444444444 | 49.949 |
| 0.8841435185185186 | 49.95 |
| 0.8841550925925926 | 49.951 |
| 0.8841666666666667 | 49.952 |
| 0.8841782407407407 | 49.95 |
| 0.8841898148148148 | 49.95 |
| 0.884201388888889 | 49.951 |
| 0.8842129629629629 | 49.951 |
| 0.8842245370370371 | 49.95 |
| 0.8842361111111111 | 49.95 |
| 0.8842476851851852 | 49.954 |
| 0.8842592592592592 | 49.953 |
| 0.8842708333333333 | 49.956 |
| 0.8842824074074075 | 49.954 |
| 0.8842939814814814 | 49.953 |
| 0.8843055555555556 | 49.95 |
| 0.8843171296296296 | 49.948 |
| 0.8843287037037038 | 49.945 |
| 0.8843402777777777 | 49.942 |
| 0.8843518518518518 | 49.939 |
| 0.884363425925926 | 49.937 |
| 0.884375 | 49.934 |
| 0.8843865740740741 | 49.931 |
| 0.8843981481481481 | 49.932 |
| 0.8844097222222222 | 49.932 |
| 0.8844212962962964 | 49.931 |
| 0.8844328703703703 | 49.929 |
| 0.8844444444444445 | 49.926 |
| 0.8844560185185185 | 49.923 |
| 0.8844675925925927 | 49.922 |
| 0.8844791666666666 | 49.922 |
| 0.8844907407407407 | 49.921 |
| 0.8845023148148149 | 49.923 |
| 0.8845138888888888 | 49.923 |
| 0.884525462962963 | 49.924 |
| 0.884537037037037 | 49.924 |
| 0.8845486111111112 | 49.925 |
| 0.8845601851851851 | 49.927 |
| 0.8845717592592592 | 49.927 |
| 0.8845833333333334 | 49.927 |
| 0.8845949074074074 | 49.926 |
| 0.8846064814814815 | 49.927 |
| 0.8846180555555555 | 49.929 |
| 0.8846296296296297 | 49.928 |
| 0.8846412037037038 | 49.928 |
| 0.8846527777777777 | 49.928 |
| 0.8846643518518519 | 49.926 |
| 0.8846759259259259 | 49.925 |
| 0.8846875000000001 | 49.922 |
| 0.884699074074074 | 49.92 |
| 0.8847106481481481 | 49.916 |
| 0.8847222222222223 | 49.916 |
| 0.8847337962962962 | 49.914 |
| 0.8847453703703704 | 49.913 |
| 0.8847569444444444 | 49.915 |
| 0.8847685185185186 | 49.917 |
| 0.8847800925925925 | 49.92 |
| 0.8847916666666666 | 49.924 |
| 0.8848032407407408 | 49.928 |
| 0.8848148148148148 | 49.933 |
| 0.8848263888888889 | 49.939 |
| 0.8848379629629629 | 49.942 |
| 0.8848495370370371 | 49.945 |
| 0.8848611111111112 | 49.948 |
| 0.8848726851851851 | 49.948 |
| 0.8848842592592593 | 49.948 |
| 0.8848958333333333 | 49.948 |
| 0.8849074074074075 | 49.948 |
| 0.8849189814814814 | 49.948 |
| 0.8849305555555556 | 49.947 |
| 0.8849421296296297 | 49.945 |
| 0.8849537037037036 | 49.945 |
| 0.8849652777777778 | 49.943 |
| 0.8849768518518518 | 49.942 |
| 0.884988425925926 | 49.942 |
| 0.8849999999999999 | 49.942 |
| 0.885011574074074 | 49.941 |
| 0.8850231481481482 | 49.94 |
| 0.8850347222222222 | 49.941 |
| 0.8850462962962963 | 49.942 |
| 0.8850578703703703 | 49.942 |
| 0.8850694444444445 | 49.941 |
| 0.8850810185185186 | 49.941 |
| 0.8850925925925925 | 49.944 |
| 0.8851041666666667 | 49.947 |
| 0.8851157407407407 | 49.949 |
| 0.8851273148148149 | 49.948 |
| 0.8851388888888888 | 49.948 |
| 0.885150462962963 | 49.949 |
| 0.8851620370370371 | 49.949 |
| 0.8851736111111111 | 49.95 |
| 0.8851851851851852 | 49.95 |
| 0.8851967592592592 | 49.95 |
| 0.8852083333333334 | 49.949 |
| 0.8852199074074073 | 49.948 |
| 0.8852314814814815 | 49.947 |
| 0.8852430555555556 | 49.949 |
| 0.8852546296296296 | 49.948 |
| 0.8852662037037037 | 49.949 |
| 0.8852777777777777 | 49.948 |
| 0.8852893518518519 | 49.948 |
| 0.885300925925926 | 49.95 |
| 0.8853125 | 49.953 |
| 0.8853240740740741 | 49.957 |
| 0.8853356481481481 | 49.961 |
| 0.8853472222222223 | 49.96 |
| 0.8853587962962962 | 49.964 |
| 0.8853703703703704 | 49.964 |
| 0.8853819444444445 | 49.966 |
| 0.8853935185185186 | 49.966 |
| 0.8854050925925926 | 49.964 |
| 0.8854166666666666 | 49.963 |
| 0.8854282407407408 | 49.96 |
| 0.8854398148148147 | 49.959 |
| 0.8854513888888889 | 49.961 |
| 0.885462962962963 | 49.963 |
| 0.885474537037037 | 49.966 |
| 0.8854861111111111 | 49.968 |
| 0.8854976851851851 | 49.971 |
| 0.8855092592592593 | 49.974 |
| 0.8855208333333334 | 49.975 |
| 0.8855324074074074 | 49.977 |
| 0.8855439814814815 | 49.977 |
| 0.8855555555555555 | 49.979 |
| 0.8855671296296297 | 49.975 |
| 0.8855787037037036 | 49.971 |
| 0.8855902777777778 | 49.968 |
| 0.8856018518518519 | 49.965 |
| 0.885613425925926 | 49.962 |
| 0.885625 | 49.961 |
| 0.885636574074074 | 49.962 |
| 0.8856481481481482 | 49.965 |
| 0.8856597222222221 | 49.967 |
| 0.8856712962962963 | 49.969 |
| 0.8856828703703704 | 49.969 |
| 0.8856944444444445 | 49.969 |
| 0.8857060185185185 | 49.969 |
| 0.8857175925925925 | 49.967 |
| 0.8857291666666667 | 49.971 |
| 0.8857407407407408 | 49.973 |
| 0.8857523148148148 | 49.974 |
| 0.8857638888888889 | 49.972 |
| 0.885775462962963 | 49.971 |
| 0.8857870370370371 | 49.97 |
| 0.885798611111111 | 49.97 |
| 0.8858101851851852 | 49.97 |
| 0.8858217592592593 | 49.972 |
| 0.8858333333333334 | 49.972 |
| 0.8858449074074074 | 49.969 |
| 0.8858564814814814 | 49.967 |
| 0.8858680555555556 | 49.968 |
| 0.8858796296296297 | 49.967 |
| 0.8858912037037037 | 49.967 |
| 0.8859027777777778 | 49.966 |
| 0.8859143518518519 | 49.966 |
| 0.8859259259259259 | 49.967 |
| 0.8859374999999999 | 49.968 |
| 0.8859490740740741 | 49.968 |
| 0.8859606481481482 | 49.968 |
| 0.8859722222222222 | 49.967 |
| 0.8859837962962963 | 49.97 |
| 0.8859953703703703 | 49.97 |
| 0.8860069444444445 | 49.971 |
| 0.8860185185185184 | 49.97 |
| 0.8860300925925926 | 49.972 |
| 0.8860416666666667 | 49.971 |
| 0.8860532407407408 | 49.971 |
| 0.8860648148148148 | 49.967 |
| 0.8860763888888888 | 49.964 |
| 0.886087962962963 | 49.96 |
| 0.8860995370370371 | 49.959 |
| 0.8861111111111111 | 49.956 |
| 0.8861226851851852 | 49.957 |
| 0.8861342592592593 | 49.957 |
| 0.8861458333333333 | 49.959 |
| 0.8861574074074073 | 49.959 |
| 0.8861689814814815 | 49.96 |
| 0.8861805555555556 | 49.959 |
| 0.8861921296296296 | 49.96 |
| 0.8862037037037037 | 49.96 |
| 0.8862152777777778 | 49.964 |
| 0.8862268518518519 | 49.965 |
| 0.8862384259259258 | 49.967 |
| 0.88625 | 49.969 |
| 0.8862615740740741 | 49.971 |
| 0.8862731481481482 | 49.971 |
| 0.8862847222222222 | 49.968 |
| 0.8862962962962962 | 49.965 |
| 0.8863078703703704 | 49.963 |
| 0.8863194444444445 | 49.959 |
| 0.8863310185185185 | 49.956 |
| 0.8863425925925926 | 49.95 |
| 0.8863541666666667 | 49.948 |
| 0.8863657407407407 | 49.943 |
| 0.8863773148148147 | 49.939 |
| 0.8863888888888889 | 49.939 |
| 0.886400462962963 | 49.939 |
| 0.886412037037037 | 49.94 |
| 0.8864236111111111 | 49.944 |
| 0.8864351851851852 | 49.945 |
| 0.8864467592592593 | 49.947 |
| 0.8864583333333332 | 49.95 |
| 0.8864699074074074 | 49.954 |
| 0.8864814814814815 | 49.955 |
| 0.8864930555555556 | 49.958 |
| 0.8865046296296296 | 49.96 |
| 0.8865162037037037 | 49.96 |
| 0.8865277777777778 | 49.958 |
| 0.886539351851852 | 49.957 |
| 0.8865509259259259 | 49.955 |
| 0.8865625 | 49.954 |
| 0.8865740740740741 | 49.953 |
| 0.8865856481481482 | 49.952 |
| 0.8865972222222221 | 49.951 |
| 0.8866087962962963 | 49.951 |
| 0.8866203703703704 | 49.949 |
| 0.8866319444444444 | 49.951 |
| 0.8866435185185185 | 49.952 |
| 0.8866550925925926 | 49.952 |
| 0.8866666666666667 | 49.955 |
| 0.8866782407407406 | 49.957 |
| 0.8866898148148148 | 49.959 |
| 0.8867013888888889 | 49.961 |
| 0.886712962962963 | 49.961 |
| 0.886724537037037 | 49.961 |
| 0.8867361111111111 | 49.96 |
| 0.8867476851851852 | 49.96 |
| 0.8867592592592594 | 49.96 |
| 0.8867708333333333 | 49.961 |
| 0.8867824074074074 | 49.962 |
| 0.8867939814814815 | 49.963 |
| 0.8868055555555556 | 49.964 |
| 0.8868171296296296 | 49.964 |
| 0.8868287037037037 | 49.961 |
| 0.8868402777777779 | 49.959 |
| 0.8868518518518518 | 49.959 |
| 0.8868634259259259 | 49.96 |
| 0.886875 | 49.96 |
| 0.8868865740740741 | 49.961 |
| 0.886898148148148 | 49.961 |
| 0.8869097222222222 | 49.965 |
| 0.8869212962962963 | 49.968 |
| 0.8869328703703704 | 49.972 |
| 0.8869444444444444 | 49.974 |
| 0.8869560185185185 | 49.975 |
| 0.8869675925925926 | 49.975 |
| 0.8869791666666668 | 49.975 |
| 0.8869907407407407 | 49.977 |
| 0.8870023148148148 | 49.979 |
| 0.8870138888888889 | 49.981 |
| 0.887025462962963 | 49.982 |
| 0.887037037037037 | 49.981 |
| 0.8870486111111111 | 49.981 |
| 0.8870601851851853 | 49.982 |
| 0.8870717592592593 | 49.983 |
| 0.8870833333333333 | 49.982 |
| 0.8870949074074074 | 49.981 |
| 0.8871064814814815 | 49.979 |
| 0.8871180555555555 | 49.974 |
| 0.8871296296296296 | 49.968 |
| 0.8871412037037038 | 49.965 |
| 0.8871527777777778 | 49.962 |
| 0.8871643518518518 | 49.963 |
| 0.8871759259259259 | 49.964 |
| 0.8871875 | 49.967 |
| 0.8871990740740742 | 49.969 |
| 0.8872106481481481 | 49.972 |
| 0.8872222222222222 | 49.974 |
| 0.8872337962962963 | 49.976 |
| 0.8872453703703704 | 49.977 |
| 0.8872569444444444 | 49.978 |
| 0.8872685185185185 | 49.978 |
| 0.8872800925925927 | 49.981 |
| 0.8872916666666667 | 49.981 |
| 0.8873032407407407 | 49.981 |
| 0.8873148148148148 | 49.979 |
| 0.8873263888888889 | 49.979 |
| 0.8873379629629629 | 49.981 |
| 0.887349537037037 | 49.982 |
| 0.8873611111111112 | 49.983 |
| 0.8873726851851852 | 49.985 |
| 0.8873842592592592 | 49.989 |
| 0.8873958333333333 | 49.99 |
| 0.8874074074074074 | 49.989 |
| 0.8874189814814816 | 49.989 |
| 0.8874305555555555 | 49.987 |
| 0.8874421296296297 | 49.988 |
| 0.8874537037037037 | 49.989 |
| 0.8874652777777778 | 49.991 |
| 0.8874768518518518 | 49.992 |
| 0.8874884259259259 | 49.994 |
| 0.8875000000000001 | 49.994 |
| 0.8875115740740741 | 49.993 |
| 0.8875231481481481 | 49.994 |
| 0.8875347222222222 | 49.997 |
| 0.8875462962962963 | 49.997 |
| 0.8875578703703703 | 50.001 |
| 0.8875694444444444 | 50.003 |
| 0.8875810185185186 | 50.005 |
| 0.8875925925925926 | 50.009 |
| 0.8876041666666666 | 50.012 |
| 0.8876157407407407 | 50.014 |
| 0.8876273148148148 | 50.015 |
| 0.887638888888889 | 50.018 |
| 0.8876504629629629 | 50.021 |
| 0.887662037037037 | 50.022 |
| 0.8876736111111111 | 50.023 |
| 0.8876851851851852 | 50.024 |
| 0.8876967592592592 | 50.022 |
| 0.8877083333333333 | 50.021 |
| 0.8877199074074075 | 50.019 |
| 0.8877314814814815 | 50.016 |
| 0.8877430555555555 | 50.013 |
| 0.8877546296296296 | 50.01 |
| 0.8877662037037037 | 50.008 |
| 0.8877777777777777 | 50.007 |
| 0.8877893518518518 | 50.008 |
| 0.887800925925926 | 50.008 |
| 0.8878125 | 50.008 |
| 0.887824074074074 | 50.007 |
| 0.8878356481481481 | 50.005 |
| 0.8878472222222222 | 50.005 |
| 0.8878587962962964 | 50.002 |
| 0.8878703703703703 | 50.002 |
| 0.8878819444444445 | 50 |
| 0.8878935185185185 | 49.999 |
| 0.8879050925925926 | 49.997 |
| 0.8879166666666666 | 49.996 |
| 0.8879282407407407 | 49.994 |
| 0.8879398148148149 | 49.993 |
| 0.8879513888888889 | 49.992 |
| 0.887962962962963 | 49.993 |
| 0.887974537037037 | 49.993 |
| 0.8879861111111111 | 49.993 |
| 0.8879976851851853 | 49.994 |
| 0.8880092592592592 | 49.996 |
| 0.8880208333333334 | 49.996 |
| 0.8880324074074074 | 49.997 |
| 0.8880439814814814 | 49.998 |
| 0.8880555555555555 | 49.998 |
| 0.8880671296296296 | 49.998 |
| 0.8880787037037038 | 49.999 |
| 0.8880902777777777 | 50.001 |
| 0.8881018518518519 | 50.003 |
| 0.8881134259259259 | 50.004 |
| 0.888125 | 50.006 |
| 0.888136574074074 | 50.008 |
| 0.8881481481481481 | 50.007 |
| 0.8881597222222223 | 50.006 |
| 0.8881712962962963 | 50.008 |
| 0.8881828703703704 | 50.006 |